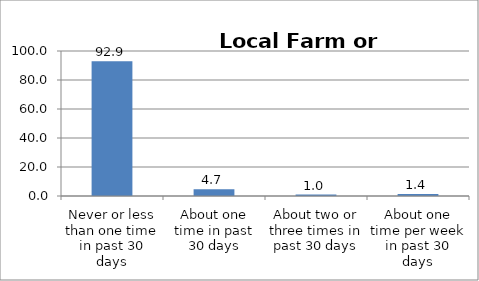
| Category | Series 0 |
|---|---|
| Never or less than one time in past 30 days | 92.856 |
| About one time in past 30 days | 4.685 |
| About two or three times in past 30 days | 1.017 |
| About one time per week in past 30 days | 1.442 |